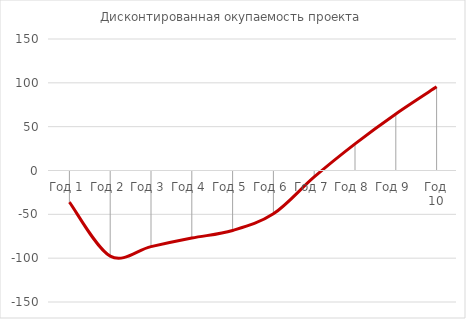
| Category | Дисконтированная окупаемость проекта |
|---|---|
| Год 1 | -36 |
| Год 2 | -97.649 |
| Год 3 | -86.812 |
| Год 4 | -77.095 |
| Год 5 | -68.382 |
| Год 6 | -49.419 |
| Год 7 | -7.309 |
| Год 8 | 30.442 |
| Год 9 | 64.563 |
| Год 10 | 95.403 |